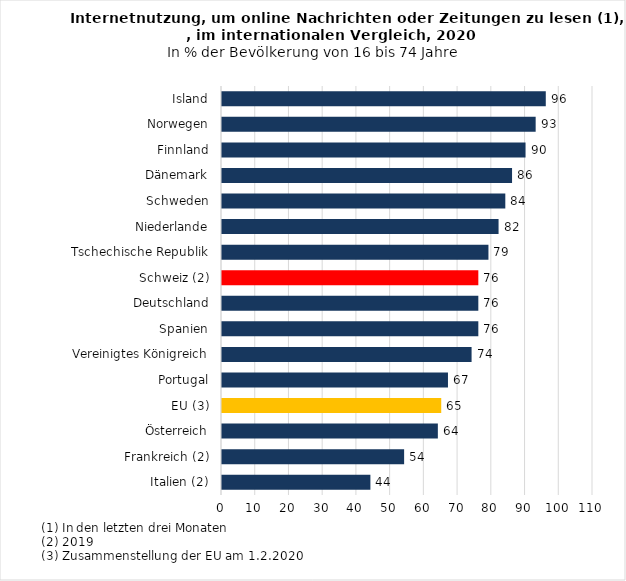
| Category | Series 0 |
|---|---|
| Italien (2) | 44 |
| Frankreich (2) | 54 |
| Österreich | 64 |
| EU (3) | 65 |
| Portugal | 67 |
| Vereinigtes Königreich | 74 |
| Spanien | 76 |
| Deutschland | 76 |
| Schweiz (2) | 76 |
| Tschechische Republik | 79 |
| Niederlande | 82 |
| Schweden | 84 |
| Dänemark | 86 |
| Finnland | 90 |
| Norwegen | 93 |
| Island | 96 |